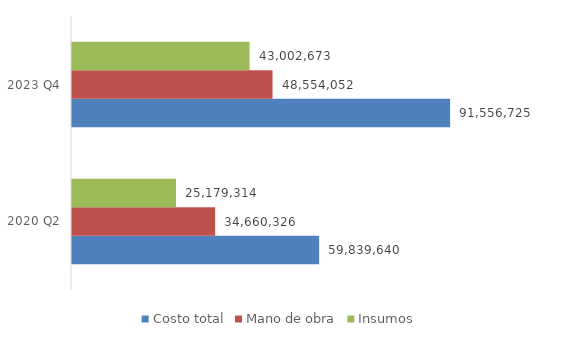
| Category | Costo total | Mano de obra | Insumos |
|---|---|---|---|
| 2020 Q2 | 59839640.335 | 34660326.001 | 25179314.333 |
| 2023 Q4 | 91556725.431 | 48554052 | 43002673.431 |